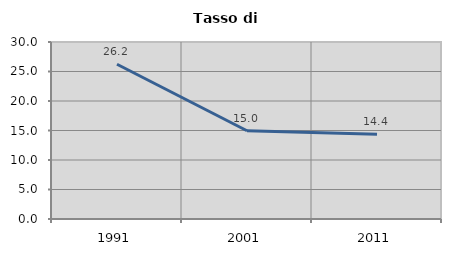
| Category | Tasso di disoccupazione   |
|---|---|
| 1991.0 | 26.23 |
| 2001.0 | 14.953 |
| 2011.0 | 14.362 |